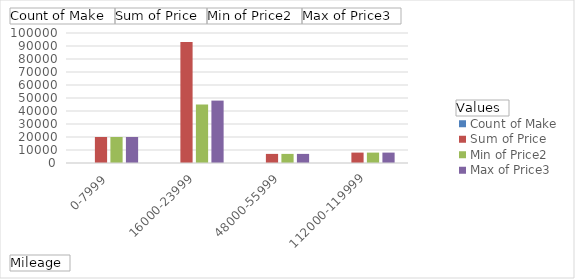
| Category | Count of Make | Sum of Price | Min of Price2 | Max of Price3 |
|---|---|---|---|---|
| 0-7999 | 1 | 20000 | 20000 | 20000 |
| 16000-23999 | 2 | 93000 | 45000 | 48000 |
| 48000-55999 | 1 | 7000 | 7000 | 7000 |
| 112000-119999 | 1 | 8000 | 8000 | 8000 |